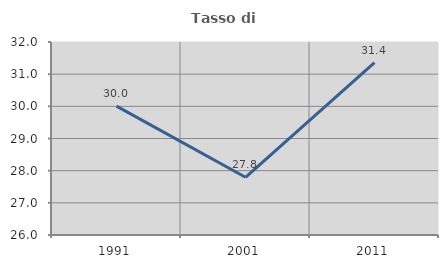
| Category | Tasso di occupazione   |
|---|---|
| 1991.0 | 30.007 |
| 2001.0 | 27.795 |
| 2011.0 | 31.356 |